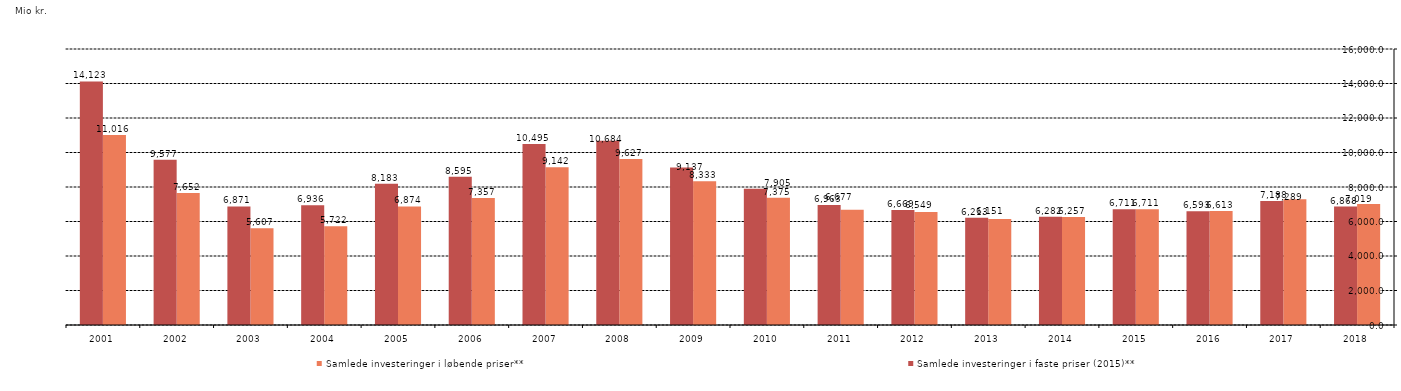
| Category | Samlede investeringer i løbende priser** | Samlede investeringer i faste priser (2015)** |
|---|---|---|
| 2018.0 | 7019.073 | 6867.978 |
| 2017.0 | 7289.114 | 7188.476 |
| 2016.0 | 6612.512 | 6592.734 |
| 2015.0 | 6711.477 | 6711.477 |
| 2014.0 | 6256.567 | 6281.693 |
| 2013.0 | 6150.937 | 6213.068 |
| 2012.0 | 6548.757 | 6668.795 |
| 2011.0 | 6677.383 | 6962.861 |
| 2010.0 | 7375.125 | 7904.743 |
| 2009.0 | 8332.907 | 9136.96 |
| 2008.0 | 9626.581 | 10684.329 |
| 2007.0 | 9142 | 10494.834 |
| 2006.0 | 7357 | 8594.626 |
| 2005.0 | 6874 | 8183.333 |
| 2004.0 | 5722 | 6935.758 |
| 2003.0 | 5607 | 6871.324 |
| 2002.0 | 7652 | 9576.971 |
| 2001.0 | 11016 | 14123.077 |